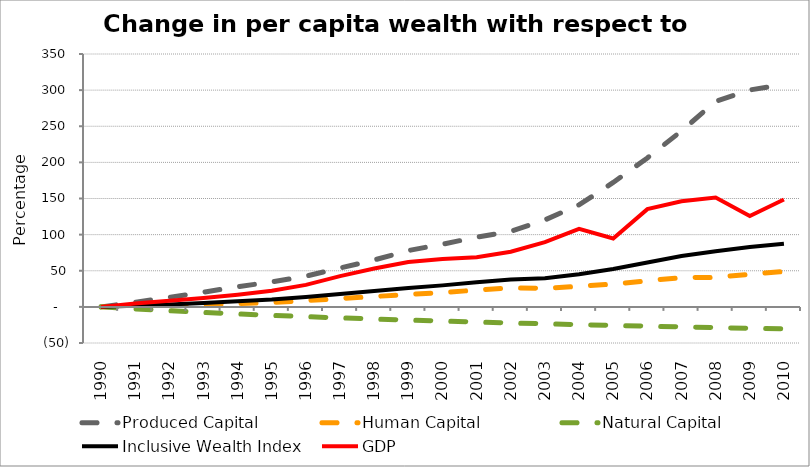
| Category | Produced Capital  | Human Capital | Natural Capital | Inclusive Wealth Index | GDP |
|---|---|---|---|---|---|
| 1990.0 | 0 | 0 | 0 | 0 | 0 |
| 1991.0 | 6.406 | 0.631 | -2.762 | 1.486 | 4.679 |
| 1992.0 | 13.242 | 1.601 | -5.3 | 3.325 | 8.326 |
| 1993.0 | 20.347 | 2.859 | -7.631 | 5.448 | 12.162 |
| 1994.0 | 27.97 | 4.354 | -9.777 | 7.85 | 16.83 |
| 1995.0 | 34.458 | 6.025 | -11.756 | 10.235 | 22.371 |
| 1996.0 | 42.43 | 8.744 | -13.579 | 13.731 | 30.413 |
| 1997.0 | 53.795 | 11.517 | -15.262 | 17.776 | 42.602 |
| 1998.0 | 64.889 | 14.333 | -16.824 | 21.818 | 53.001 |
| 1999.0 | 77.954 | 17.132 | -18.29 | 26.138 | 61.995 |
| 2000.0 | 86.764 | 19.844 | -19.676 | 29.753 | 66.222 |
| 2001.0 | 96.455 | 23.231 | -20.993 | 34.073 | 68.839 |
| 2002.0 | 104.518 | 26.419 | -22.246 | 37.982 | 76.272 |
| 2003.0 | 120.36 | 25.43 | -23.439 | 39.491 | 89.614 |
| 2004.0 | 141.21 | 28.529 | -24.576 | 45.223 | 107.936 |
| 2005.0 | 172.248 | 31.492 | -25.663 | 52.351 | 94.699 |
| 2006.0 | 206.152 | 36.182 | -26.7 | 61.374 | 135.261 |
| 2007.0 | 243.523 | 40.312 | -27.695 | 70.436 | 146.211 |
| 2008.0 | 284.32 | 40.864 | -28.657 | 76.961 | 151.277 |
| 2009.0 | 300.203 | 44.95 | -29.597 | 82.795 | 125.836 |
| 2010.0 | 308.014 | 48.961 | -30.521 | 87.367 | 148.668 |